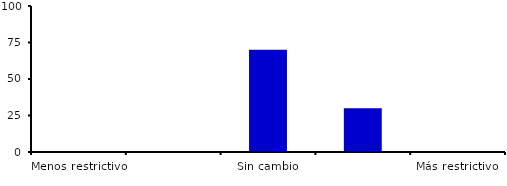
| Category | Series 0 |
|---|---|
| Menos restrictivo | 0 |
| Moderadamente menos restrictivo | 0 |
| Sin cambio | 70 |
| Moderadamente más restrictivo | 30 |
| Más restrictivo | 0 |